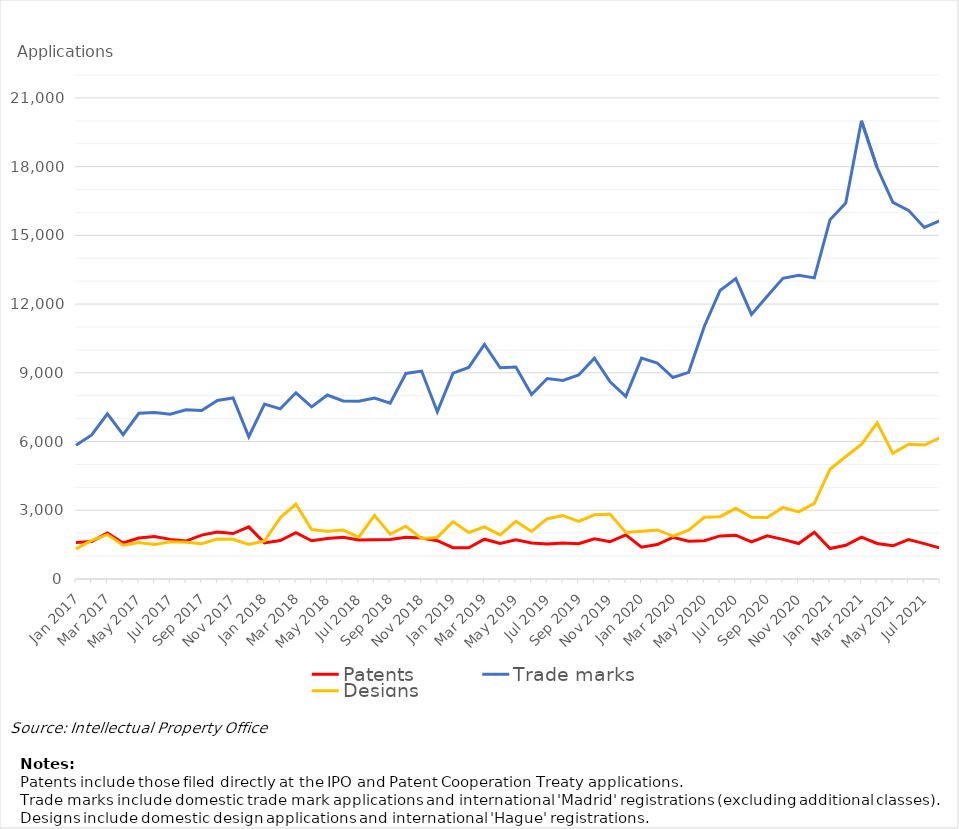
| Category | Patents | Trade marks | Designs |
|---|---|---|---|
| Jan 2017 | 1596 | 5843 | 1318 |
| Feb 2017 | 1640 | 6288 | 1687 |
| Mar 2017 | 2011 | 7214 | 1940 |
| Apr 2017 | 1573 | 6297 | 1474 |
| May 2017 | 1790 | 7234 | 1592 |
| Jun 2017 | 1853 | 7263 | 1502 |
| Jul 2017 | 1730 | 7197 | 1627 |
| Aug 2017 | 1657 | 7389 | 1600 |
| Sep 2017 | 1915 | 7359 | 1544 |
| Oct 2017 | 2055 | 7792 | 1745 |
| Nov 2017 | 1983 | 7901 | 1736 |
| Dec 2017 | 2277 | 6211 | 1507 |
| Jan 2018 | 1575 | 7634 | 1658 |
| Feb 2018 | 1676 | 7428 | 2672 |
| Mar 2018 | 2022 | 8127 | 3267 |
| Apr 2018 | 1670 | 7512 | 2160 |
| May 2018 | 1767 | 8030 | 2083 |
| Jun 2018 | 1821 | 7769 | 2136 |
| Jul 2018 | 1704 | 7757 | 1832 |
| Aug 2018 | 1713 | 7897 | 2777 |
| Sep 2018 | 1725 | 7673 | 1960 |
| Oct 2018 | 1818 | 8972 | 2302 |
| Nov 2018 | 1787 | 9076 | 1765 |
| Dec 2018 | 1670 | 7304 | 1815 |
| Jan 2019 | 1367 | 8984 | 2505 |
| Feb 2019 | 1361 | 9234 | 2031 |
| Mar 2019 | 1737 | 10243 | 2274 |
| Apr 2019 | 1552 | 9219 | 1923 |
| May 2019 | 1710 | 9251 | 2520 |
| Jun 2019 | 1569 | 8053 | 2074 |
| Jul 2019 | 1527 | 8752 | 2634 |
| Aug 2019 | 1571 | 8670 | 2768 |
| Sep 2019 | 1540 | 8907 | 2511 |
| Oct 2019 | 1755 | 9636 | 2800 |
| Nov 2019 | 1630 | 8607 | 2827 |
| Dec 2019 | 1926 | 7970 | 2028 |
| Jan 2020 | 1392 | 9642 | 2082 |
| Feb 2020 | 1506 | 9428 | 2143 |
| Mar 2020 | 1819 | 8794 | 1871 |
| Apr 2020 | 1648 | 9021 | 2127 |
| May 2020 | 1671 | 11035 | 2694 |
| Jun 2020 | 1880 | 12593 | 2721 |
| Jul 2020 | 1911 | 13110 | 3085 |
| Aug 2020 | 1616 | 11551 | 2694 |
| Sep 2020 | 1886 | 12340 | 2686 |
| Oct 2020 | 1731 | 13126 | 3124 |
| Nov 2020 | 1548 | 13254 | 2930 |
| Dec 2020 | 2043 | 13143 | 3303 |
| Jan 2021 | 1330 | 15686 | 4792 |
| Feb 2021 | 1472 | 16412 | 5347 |
| Mar 2021 | 1827 | 20001 | 5878 |
| Apr 2021 | 1553 | 17951 | 6813 |
| May 2021 | 1449 | 16444 | 5483 |
| Jun 2021 | 1718 | 16092 | 5881 |
| Jul 2021 | 1543 | 15344 | 5845 |
| Aug 2021 | 1350 | 15636 | 6173 |